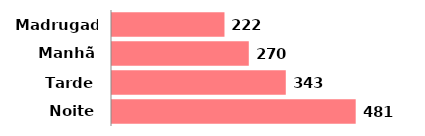
| Category | Qtde |
|---|---|
| Madrugada | 222 |
| Manhã | 270 |
| Tarde | 343 |
| Noite | 481 |